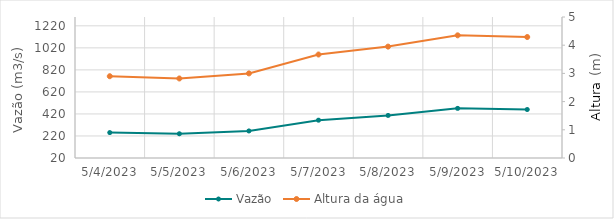
| Category | Vazão |
|---|---|
| 5/10/23 | 665.01 |
| 5/9/23 | 721.38 |
| 5/8/23 | 709.96 |
| 5/7/23 | 610.29 |
| 5/6/23 | 593.21 |
| 5/5/23 | 570.43 |
| 5/4/23 | 564.8 |